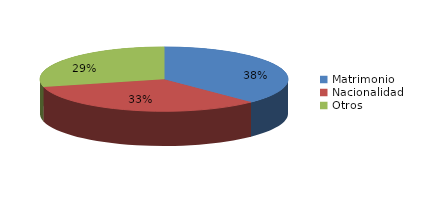
| Category | Series 0 |
|---|---|
| Matrimonio | 786 |
| Nacionalidad | 698 |
| Otros | 604 |